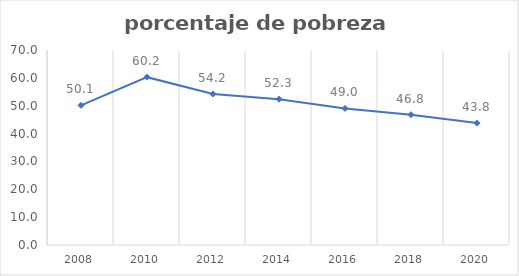
| Category | Series 0 |
|---|---|
| 2008.0 | 50.132 |
| 2010.0 | 60.247 |
| 2012.0 | 54.214 |
| 2014.0 | 52.346 |
| 2016.0 | 49.004 |
| 2018.0 | 46.761 |
| 2020.0 | 43.757 |